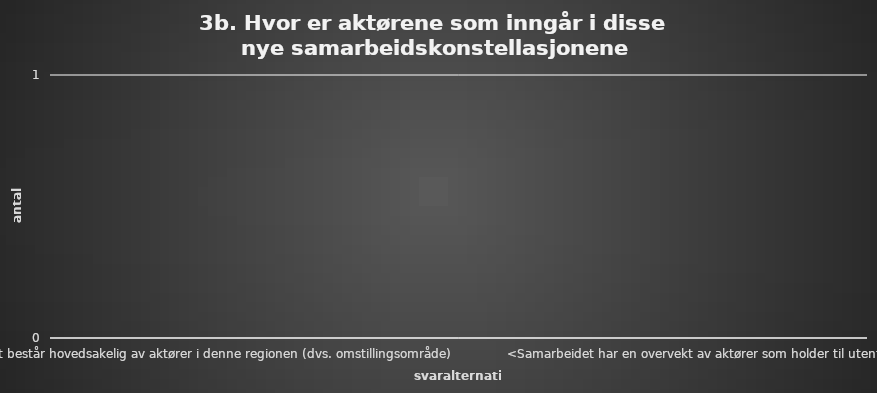
| Category | Series 0 |
|---|---|
| <Samarbeidet består hovedsakelig av aktører i denne regionen (dvs. omstillingsområde) | 0 |
| <I samarbeidet inngår det både aktører i denne regionen og aktører utenfor regionen | 0 |
| <Samarbeidet har en overvekt av aktører som holder til utenfor regionen | 0 |